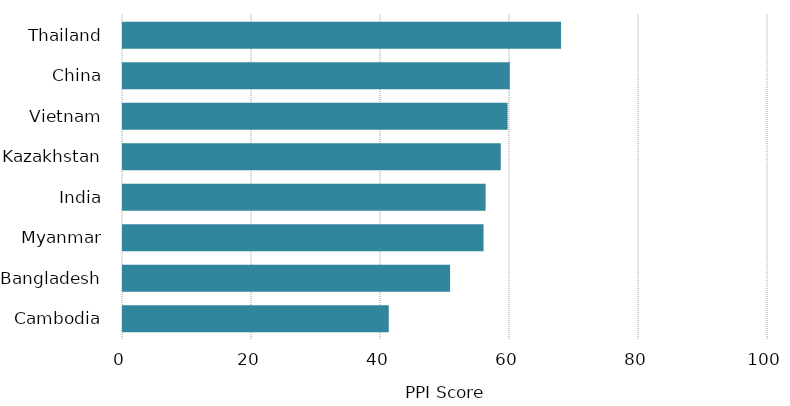
| Category | PPI Score |
|---|---|
| Cambodia | 41.355 |
| Bangladesh | 50.868 |
| Myanmar | 56.054 |
| India | 56.373 |
| Kazakhstan | 58.72 |
| Vietnam | 59.786 |
| China | 60.125 |
| Thailand | 68.071 |